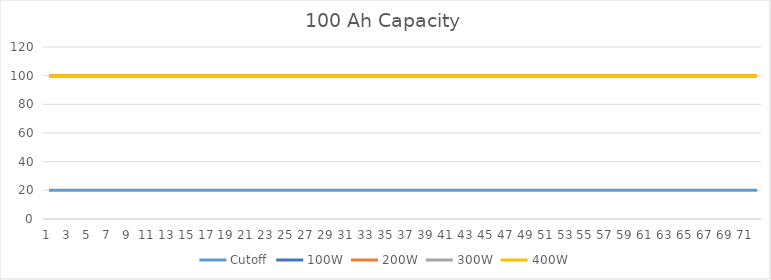
| Category | Cutoff | 100W | 200W | 300W | 400W |
|---|---|---|---|---|---|
| 0 | 20 | 100 | 100 | 100 | 100 |
| 1 | 20 | 100 | 100 | 100 | 100 |
| 2 | 20 | 100 | 100 | 100 | 100 |
| 3 | 20 | 100 | 100 | 100 | 100 |
| 4 | 20 | 100 | 100 | 100 | 100 |
| 5 | 20 | 100 | 100 | 100 | 100 |
| 6 | 20 | 100 | 100 | 100 | 100 |
| 7 | 20 | 100 | 100 | 100 | 100 |
| 8 | 20 | 100 | 100 | 100 | 100 |
| 9 | 20 | 100 | 100 | 100 | 100 |
| 10 | 20 | 100 | 100 | 100 | 100 |
| 11 | 20 | 100 | 100 | 100 | 100 |
| 12 | 20 | 100 | 100 | 100 | 100 |
| 13 | 20 | 100 | 100 | 100 | 100 |
| 14 | 20 | 100 | 100 | 100 | 100 |
| 15 | 20 | 100 | 100 | 100 | 100 |
| 16 | 20 | 100 | 100 | 100 | 100 |
| 17 | 20 | 100 | 100 | 100 | 100 |
| 18 | 20 | 100 | 100 | 100 | 100 |
| 19 | 20 | 100 | 100 | 100 | 100 |
| 20 | 20 | 100 | 100 | 100 | 100 |
| 21 | 20 | 100 | 100 | 100 | 100 |
| 22 | 20 | 100 | 100 | 100 | 100 |
| 23 | 20 | 100 | 100 | 100 | 100 |
| 24 | 20 | 100 | 100 | 100 | 100 |
| 25 | 20 | 100 | 100 | 100 | 100 |
| 26 | 20 | 100 | 100 | 100 | 100 |
| 27 | 20 | 100 | 100 | 100 | 100 |
| 28 | 20 | 100 | 100 | 100 | 100 |
| 29 | 20 | 100 | 100 | 100 | 100 |
| 30 | 20 | 100 | 100 | 100 | 100 |
| 31 | 20 | 100 | 100 | 100 | 100 |
| 32 | 20 | 100 | 100 | 100 | 100 |
| 33 | 20 | 100 | 100 | 100 | 100 |
| 34 | 20 | 100 | 100 | 100 | 100 |
| 35 | 20 | 100 | 100 | 100 | 100 |
| 36 | 20 | 100 | 100 | 100 | 100 |
| 37 | 20 | 100 | 100 | 100 | 100 |
| 38 | 20 | 100 | 100 | 100 | 100 |
| 39 | 20 | 100 | 100 | 100 | 100 |
| 40 | 20 | 100 | 100 | 100 | 100 |
| 41 | 20 | 100 | 100 | 100 | 100 |
| 42 | 20 | 100 | 100 | 100 | 100 |
| 43 | 20 | 100 | 100 | 100 | 100 |
| 44 | 20 | 100 | 100 | 100 | 100 |
| 45 | 20 | 100 | 100 | 100 | 100 |
| 46 | 20 | 100 | 100 | 100 | 100 |
| 47 | 20 | 100 | 100 | 100 | 100 |
| 48 | 20 | 100 | 100 | 100 | 100 |
| 49 | 20 | 100 | 100 | 100 | 100 |
| 50 | 20 | 100 | 100 | 100 | 100 |
| 51 | 20 | 100 | 100 | 100 | 100 |
| 52 | 20 | 100 | 100 | 100 | 100 |
| 53 | 20 | 100 | 100 | 100 | 100 |
| 54 | 20 | 100 | 100 | 100 | 100 |
| 55 | 20 | 100 | 100 | 100 | 100 |
| 56 | 20 | 100 | 100 | 100 | 100 |
| 57 | 20 | 100 | 100 | 100 | 100 |
| 58 | 20 | 100 | 100 | 100 | 100 |
| 59 | 20 | 100 | 100 | 100 | 100 |
| 60 | 20 | 100 | 100 | 100 | 100 |
| 61 | 20 | 100 | 100 | 100 | 100 |
| 62 | 20 | 100 | 100 | 100 | 100 |
| 63 | 20 | 100 | 100 | 100 | 100 |
| 64 | 20 | 100 | 100 | 100 | 100 |
| 65 | 20 | 100 | 100 | 100 | 100 |
| 66 | 20 | 100 | 100 | 100 | 100 |
| 67 | 20 | 100 | 100 | 100 | 100 |
| 68 | 20 | 100 | 100 | 100 | 100 |
| 69 | 20 | 100 | 100 | 100 | 100 |
| 70 | 20 | 100 | 100 | 100 | 100 |
| 71 | 20 | 100 | 100 | 100 | 100 |